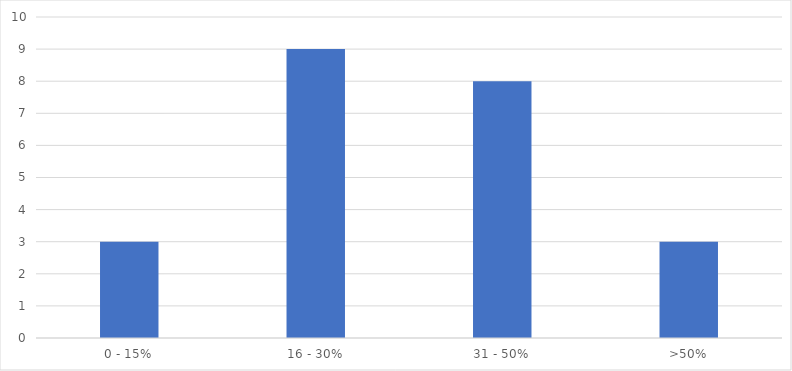
| Category | Number of Responses |
|---|---|
| 0 - 15% | 3 |
| 16 - 30% | 9 |
| 31 - 50% | 8 |
| >50% | 3 |